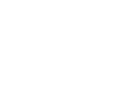
| Category | Series 0 |
|---|---|
| Ja | 0 |
| Nej | 0 |